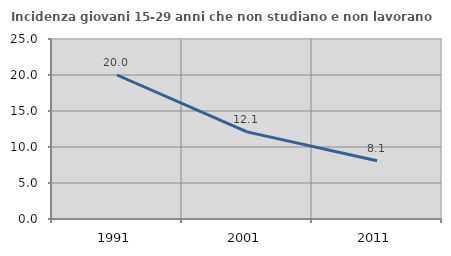
| Category | Incidenza giovani 15-29 anni che non studiano e non lavorano  |
|---|---|
| 1991.0 | 20 |
| 2001.0 | 12.102 |
| 2011.0 | 8.1 |